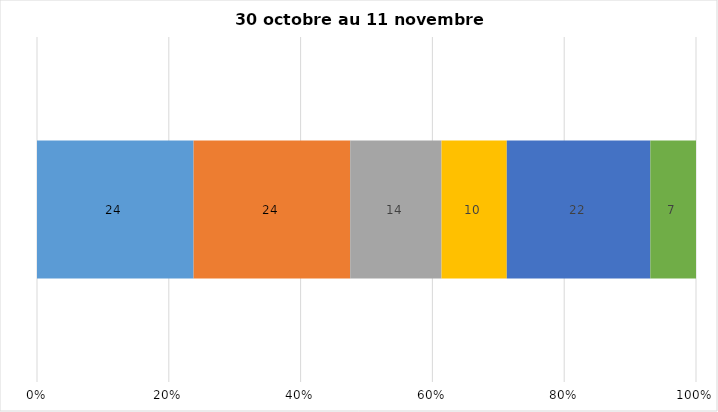
| Category | Plusieurs fois par jour | Une fois par jour | Quelques fois par semaine   | Une fois par semaine ou moins   |  Jamais   |  Je n’utilise pas les médias sociaux |
|---|---|---|---|---|---|---|
| 0 | 24 | 24 | 14 | 10 | 22 | 7 |